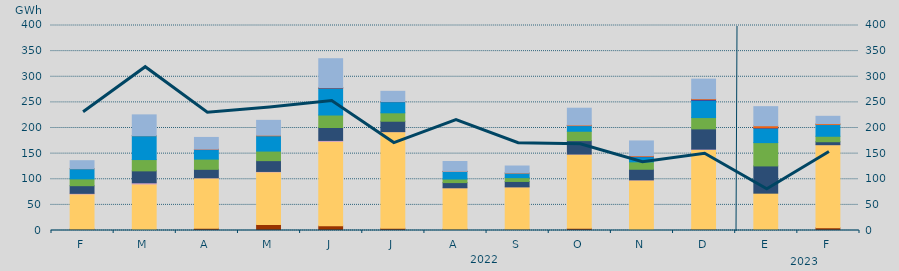
| Category | Carbón | Ciclo Combinado | Cogeneración | Consumo Bombeo | Eólica | Hidráulica | Nuclear | Solar fotovoltaica | Solar térmica | Turbinación bombeo |
|---|---|---|---|---|---|---|---|---|---|---|
| F | 2568.1 | 68716.7 | 1177.2 | 14975 | 13257.2 | 19925.5 | 0 | 116 | 0 | 15456.1 |
| M | 1920.2 | 88833.3 | 2368.3 | 23235.2 | 22069.1 | 46579.6 | 0 | 131 | 0 | 40486 |
| A | 4593.5 | 97889.1 | 405.8 | 16475.5 | 19937.3 | 18601.3 | 663.3 | 233.1 | 0 | 22786.5 |
| M | 11875.65 | 102430.975 | 928.85 | 21079.775 | 18647.725 | 29842.925 | 0 | 1098.75 | 0 | 29000.65 |
| J | 9138.825 | 164797.65 | 1808.4 | 25204.95 | 24371.3 | 52553.275 | 599.625 | 596 | 0 | 56106.775 |
| J | 4302 | 188455.5 | 190.325 | 20249.475 | 16437.65 | 21832.925 | 50 | 230.625 | 0 | 19818.55 |
| A | 2452.3 | 80908.85 | 69.8 | 10038.425 | 6983.45 | 14747.025 | 33 | 300.1 | 0 | 19076.4 |
| S | 2236 | 82926.675 | 23 | 10509.975 | 7386.425 | 8900.725 | 0 | 476.125 | 0 | 13369.775 |
| O | 4283 | 144842.475 | 127.925 | 26134.8 | 18277.325 | 11041.025 | 22.5 | 1111.175 | 0 | 32778.95 |
| N | 861.375 | 97623.7 | 419.15 | 20591.575 | 14440 | 9978.175 | 722.075 | 1239.075 | 0 | 28866.575 |
| D | 2372.95 | 155746.55 | 697.65 | 39478.975 | 22031.425 | 33537.4 | 2006.425 | 1334.875 | 0 | 38128.575 |
| E | 1284.5 | 71547.4 | 0 | 53164.775 | 45462.95 | 28173.35 | 832.7 | 3920.525 | 0 | 37262.825 |
| F | 5209.75 | 162258.025 | 4.5 | 5734.4 | 10650.1 | 22890.65 | 0 | 1697.2 | 0 | 14370.575 |